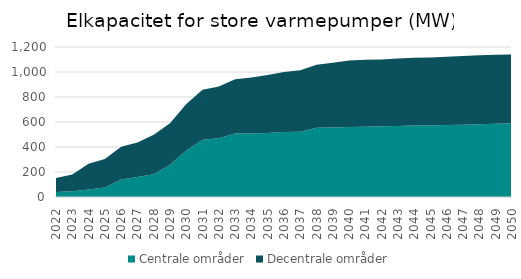
| Category | Centrale områder | Decentrale områder |
|---|---|---|
| 2022.0 | 39.97 | 112.11 |
| 2023.0 | 45.75 | 133.53 |
| 2024.0 | 60.52 | 206.38 |
| 2025.0 | 75.93 | 229.05 |
| 2026.0 | 140.01 | 261.99 |
| 2027.0 | 159.01 | 277.82 |
| 2028.0 | 182.32 | 316.63 |
| 2029.0 | 257.33 | 332.12 |
| 2030.0 | 372.54 | 371.29 |
| 2031.0 | 458.45 | 399.42 |
| 2032.0 | 470.87 | 413.57 |
| 2033.0 | 507.19 | 435.47 |
| 2034.0 | 508.82 | 447.31 |
| 2035.0 | 512.77 | 463.88 |
| 2036.0 | 519.72 | 479.3 |
| 2037.0 | 522.34 | 490.96 |
| 2038.0 | 553.27 | 503.9 |
| 2039.0 | 555.9 | 518.2 |
| 2040.0 | 560.24 | 531.79 |
| 2041.0 | 562.87 | 534.44 |
| 2042.0 | 566.08 | 534.44 |
| 2043.0 | 568.9 | 539.07 |
| 2044.0 | 571.54 | 541.91 |
| 2045.0 | 571.54 | 544.78 |
| 2046.0 | 575.77 | 546.29 |
| 2047.0 | 578.4 | 549.1 |
| 2048.0 | 582.4 | 551.34 |
| 2049.0 | 586.75 | 551.34 |
| 2050.0 | 589.38 | 551.34 |